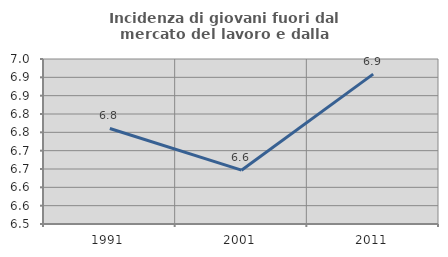
| Category | Incidenza di giovani fuori dal mercato del lavoro e dalla formazione  |
|---|---|
| 1991.0 | 6.761 |
| 2001.0 | 6.647 |
| 2011.0 | 6.909 |